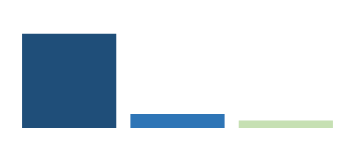
| Category | Series 0 |
|---|---|
| Car | 100 |
| Bus | 15 |
| Train | 8 |